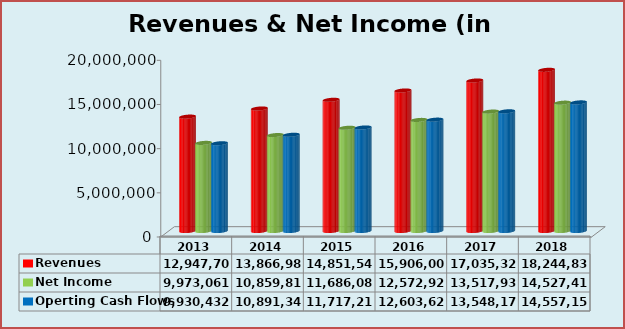
| Category | Revenues | Net Income | Operting Cash Flows |
|---|---|---|---|
| 2013.0 | 12947700 | 9973061.34 | 9930432.173 |
| 2014.0 | 13866986.7 | 10859814.184 | 10891346.313 |
| 2015.0 | 14851542.756 | 11686081.662 | 11717211.372 |
| 2016.0 | 15906002.291 | 12572927.803 | 12603626.523 |
| 2017.0 | 17035328.454 | 13517936.743 | 13548173.872 |
| 2018.0 | 18244836.774 | 14527414.196 | 14557156.961 |